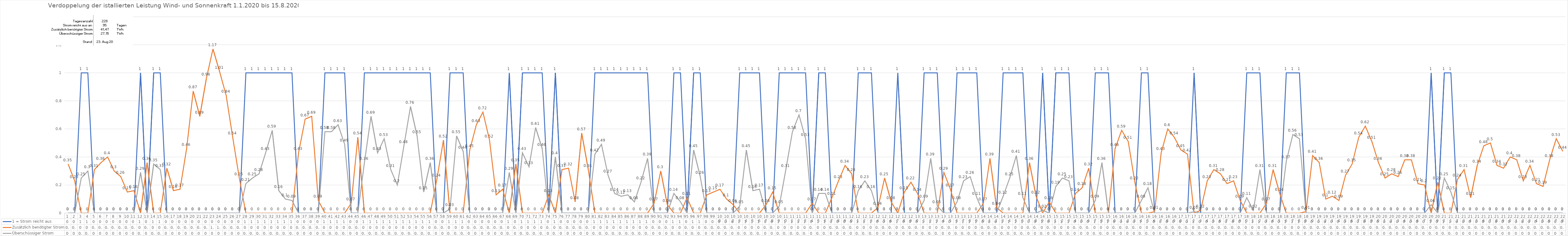
| Category | 1 = Strom reicht aus | Zusätzlich benötigter Strom | Überschüssiger Strom |
|---|---|---|---|
| 0 | 0 | 0.35 | 0 |
| 1 | 0 | 0.23 | 0 |
| 2 | 1 | 0 | 0.25 |
| 3 | 1 | 0 | 0.3 |
| 4 | 0 | 0.31 | 0 |
| 5 | 0 | 0.36 | 0 |
| 6 | 0 | 0.4 | 0 |
| 7 | 0 | 0.3 | 0 |
| 8 | 0 | 0.26 | 0 |
| 9 | 0 | 0.15 | 0 |
| 10 | 0 | 0.16 | 0 |
| 11 | 1 | 0 | 0.29 |
| 12 | 0 | 0.36 | 0 |
| 13 | 1 | 0 | 0.35 |
| 14 | 1 | 0 | 0.31 |
| 15 | 0 | 0.32 | 0 |
| 16 | 0 | 0.16 | 0 |
| 17 | 0 | 0.17 | 0 |
| 18 | 0 | 0.46 | 0 |
| 19 | 0 | 0.87 | 0 |
| 20 | 0 | 0.69 | 0 |
| 21 | 0 | 0.96 | 0 |
| 22 | 0 | 1.17 | 0 |
| 23 | 0 | 1.01 | 0 |
| 24 | 0 | 0.84 | 0 |
| 25 | 0 | 0.54 | 0 |
| 26 | 0 | 0.25 | 0 |
| 27 | 1 | 0 | 0.21 |
| 28 | 1 | 0 | 0.25 |
| 29 | 1 | 0 | 0.28 |
| 30 | 1 | 0 | 0.43 |
| 31 | 1 | 0 | 0.59 |
| 32 | 1 | 0 | 0.16 |
| 33 | 1 | 0 | 0.1 |
| 34 | 1 | 0 | 0.09 |
| 35 | 0 | 0.43 | 0 |
| 36 | 0 | 0.67 | 0 |
| 37 | 0 | 0.69 | 0 |
| 38 | 0 | 0.09 | 0 |
| 39 | 1 | 0 | 0.58 |
| 40 | 1 | 0 | 0.58 |
| 41 | 1 | 0 | 0.63 |
| 42 | 1 | 0 | 0.49 |
| 43 | 0 | 0.07 | 0 |
| 44 | 0 | 0.54 | 0 |
| 45 | 1 | 0 | 0.36 |
| 46 | 1 | 0 | 0.69 |
| 47 | 1 | 0 | 0.43 |
| 48 | 1 | 0 | 0.53 |
| 49 | 1 | 0 | 0.31 |
| 50 | 1 | 0 | 0.2 |
| 51 | 1 | 0 | 0.48 |
| 52 | 1 | 0 | 0.76 |
| 53 | 1 | 0 | 0.55 |
| 54 | 1 | 0 | 0.15 |
| 55 | 1 | 0 | 0.36 |
| 56 | 0 | 0.24 | 0 |
| 57 | 0 | 0.52 | 0 |
| 58 | 1 | 0 | 0.03 |
| 59 | 1 | 0 | 0.55 |
| 60 | 1 | 0 | 0.44 |
| 61 | 0 | 0.45 | 0 |
| 62 | 0 | 0.63 | 0 |
| 63 | 0 | 0.72 | 0 |
| 64 | 0 | 0.52 | 0 |
| 65 | 0 | 0.13 | 0 |
| 66 | 0 | 0.17 | 0 |
| 67 | 1 | 0 | 0.29 |
| 68 | 0 | 0.35 | 0 |
| 69 | 1 | 0 | 0.43 |
| 70 | 1 | 0 | 0.33 |
| 71 | 1 | 0 | 0.61 |
| 72 | 1 | 0 | 0.46 |
| 73 | 0 | 0.13 | 0 |
| 74 | 1 | 0 | 0.4 |
| 75 | 0 | 0.31 | 0 |
| 76 | 0 | 0.32 | 0 |
| 77 | 0 | 0.08 | 0 |
| 78 | 0 | 0.57 | 0 |
| 79 | 0 | 0.31 | 0 |
| 80 | 1 | 0 | 0.42 |
| 81 | 1 | 0 | 0.49 |
| 82 | 1 | 0 | 0.27 |
| 83 | 1 | 0 | 0.14 |
| 84 | 1 | 0 | 0.12 |
| 85 | 1 | 0 | 0.13 |
| 86 | 1 | 0 | 0.08 |
| 87 | 1 | 0 | 0.22 |
| 88 | 1 | 0 | 0.39 |
| 89 | 0 | 0.07 | 0 |
| 90 | 0 | 0.3 | 0 |
| 91 | 0 | 0.06 | 0 |
| 92 | 1 | 0 | 0.14 |
| 93 | 1 | 0 | 0.08 |
| 94 | 0 | 0.11 | 0 |
| 95 | 1 | 0 | 0.45 |
| 96 | 1 | 0 | 0.26 |
| 97 | 0 | 0.13 | 0 |
| 98 | 0 | 0.15 | 0 |
| 99 | 0 | 0.17 | 0 |
| 100 | 0 | 0.1 | 0 |
| 101 | 0 | 0.06 | 0 |
| 102 | 1 | 0 | 0.05 |
| 103 | 1 | 0 | 0.45 |
| 104 | 1 | 0 | 0.16 |
| 105 | 1 | 0 | 0.17 |
| 106 | 0 | 0.06 | 0 |
| 107 | 0 | 0.15 | 0 |
| 108 | 1 | 0 | 0.05 |
| 109 | 1 | 0 | 0.31 |
| 110 | 1 | 0 | 0.58 |
| 111 | 1 | 0 | 0.7 |
| 112 | 1 | 0 | 0.53 |
| 113 | 0 | 0.07 | 0 |
| 114 | 1 | 0 | 0.14 |
| 115 | 1 | 0 | 0.14 |
| 116 | 0 | 0.11 | 0 |
| 117 | 0 | 0.23 | 0 |
| 118 | 0 | 0.34 | 0 |
| 119 | 0 | 0.28 | 0 |
| 120 | 1 | 0 | 0.16 |
| 121 | 1 | 0 | 0.23 |
| 122 | 1 | 0 | 0.16 |
| 123 | 0 | 0.04 | 0 |
| 124 | 0 | 0.25 | 0 |
| 125 | 0 | 0.08 | 0 |
| 126 | 1 | 0 | 0 |
| 127 | 0 | 0.15 | 0 |
| 128 | 0 | 0.22 | 0 |
| 129 | 0 | 0.14 | 0 |
| 130 | 1 | 0 | 0.09 |
| 131 | 1 | 0 | 0.39 |
| 132 | 1 | 0 | 0.05 |
| 133 | 0 | 0.29 | 0 |
| 134 | 0 | 0.17 | 0 |
| 135 | 1 | 0 | 0.08 |
| 136 | 1 | 0 | 0.23 |
| 137 | 1 | 0 | 0.26 |
| 138 | 1 | 0 | 0.11 |
| 139 | 0 | 0.07 | 0 |
| 140 | 0 | 0.39 | 0 |
| 141 | 0 | 0.04 | 0 |
| 142 | 1 | 0 | 0.12 |
| 143 | 1 | 0 | 0.25 |
| 144 | 1 | 0 | 0.41 |
| 145 | 1 | 0 | 0.11 |
| 146 | 0 | 0.36 | 0 |
| 147 | 0 | 0.12 | 0 |
| 148 | 1 | 0 | 0.02 |
| 149 | 0 | 0.08 | 0 |
| 150 | 1 | 0 | 0.19 |
| 151 | 1 | 0 | 0.25 |
| 152 | 1 | 0 | 0.23 |
| 153 | 0 | 0.14 | 0 |
| 154 | 0 | 0.18 | 0 |
| 155 | 0 | 0.32 | 0 |
| 156 | 1 | 0 | 0.09 |
| 157 | 1 | 0 | 0.36 |
| 158 | 1 | 0 | 0 |
| 159 | 0 | 0.46 | 0 |
| 160 | 0 | 0.59 | 0 |
| 161 | 0 | 0.51 | 0 |
| 162 | 0 | 0.22 | 0 |
| 163 | 1 | 0 | 0.09 |
| 164 | 1 | 0 | 0.18 |
| 165 | 0 | 0.01 | 0 |
| 166 | 0 | 0.43 | 0 |
| 167 | 0 | 0.6 | 0 |
| 168 | 0 | 0.54 | 0 |
| 169 | 0 | 0.45 | 0 |
| 170 | 0 | 0.42 | 0 |
| 171 | 1 | 0 | 0.01 |
| 172 | 0 | 0.02 | 0 |
| 173 | 0 | 0.23 | 0 |
| 174 | 0 | 0.31 | 0 |
| 175 | 0 | 0.28 | 0 |
| 176 | 0 | 0.21 | 0 |
| 177 | 0 | 0.23 | 0 |
| 178 | 0 | 0.09 | 0 |
| 179 | 1 | 0 | 0.11 |
| 180 | 1 | 0 | 0.02 |
| 181 | 1 | 0 | 0.31 |
| 182 | 0 | 0.07 | 0 |
| 183 | 0 | 0.31 | 0 |
| 184 | 0 | 0.14 | 0 |
| 185 | 1 | 0 | 0.37 |
| 186 | 1 | 0 | 0.56 |
| 187 | 1 | 0 | 0.53 |
| 188 | 0 | 0.01 | 0 |
| 189 | 0 | 0.41 | 0 |
| 190 | 0 | 0.36 | 0 |
| 191 | 0 | 0.1 | 0 |
| 192 | 0 | 0.12 | 0 |
| 193 | 0 | 0.09 | 0 |
| 194 | 0 | 0.27 | 0 |
| 195 | 0 | 0.35 | 0 |
| 196 | 0 | 0.54 | 0 |
| 197 | 0 | 0.62 | 0 |
| 198 | 0 | 0.51 | 0 |
| 199 | 0 | 0.36 | 0 |
| 200 | 0 | 0.25 | 0 |
| 201 | 0 | 0.28 | 0 |
| 202 | 0 | 0.26 | 0 |
| 203 | 0 | 0.38 | 0 |
| 204 | 0 | 0.38 | 0 |
| 205 | 0 | 0.21 | 0 |
| 206 | 0 | 0.2 | 0 |
| 207 | 1 | 0 | 0.06 |
| 208 | 0 | 0.22 | 0 |
| 209 | 1 | 0 | 0.25 |
| 210 | 1 | 0 | 0.15 |
| 211 | 0 | 0.24 | 0 |
| 212 | 0 | 0.31 | 0 |
| 213 | 0 | 0.11 | 0 |
| 214 | 0 | 0.34 | 0 |
| 215 | 0 | 0.48 | 0 |
| 216 | 0 | 0.5 | 0 |
| 217 | 0 | 0.34 | 0 |
| 218 | 0 | 0.32 | 0 |
| 219 | 0 | 0.4 | 0 |
| 220 | 0 | 0.38 | 0 |
| 221 | 0 | 0.23 | 0 |
| 222 | 0 | 0.34 | 0 |
| 223 | 0 | 0.21 | 0 |
| 224 | 0 | 0.19 | 0 |
| 225 | 0 | 0.38 | 0 |
| 226 | 0 | 0.53 | 0 |
| 227 | 0 | 0.44 | 0 |